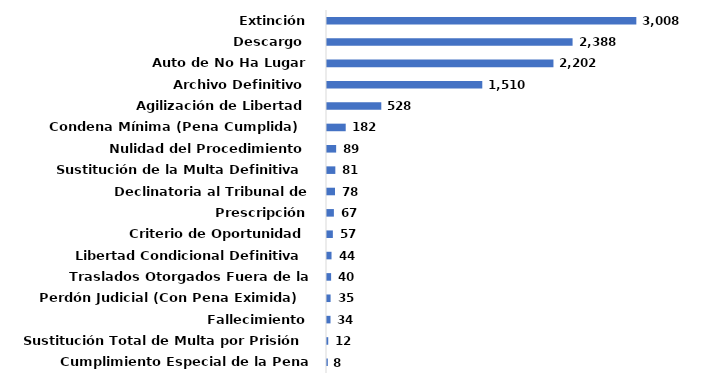
| Category | Series 0 |
|---|---|
| Cumplimiento Especial de la Pena Definitivo | 0.001 |
| Sustitución Total de Multa por Prisión | 0.001 |
| Fallecimiento | 0.003 |
| Perdón Judicial (Con Pena Eximida)  | 0.003 |
| Traslados Otorgados Fuera de la Jurisdicción | 0.004 |
| Libertad Condicional Definitiva | 0.004 |
| Criterio de Oportunidad | 0.006 |
| Prescripción | 0.006 |
| Declinatoria al Tribunal de Adolescentes | 0.008 |
| Sustitución de la Multa Definitiva | 0.008 |
| Nulidad del Procedimiento | 0.009 |
| Condena Mínima (Pena Cumplida)  | 0.018 |
| Agilización de Libertad | 0.051 |
| Archivo Definitivo | 0.146 |
| Auto de No Ha Lugar | 0.212 |
| Descargo  | 0.23 |
| Extinción | 0.29 |